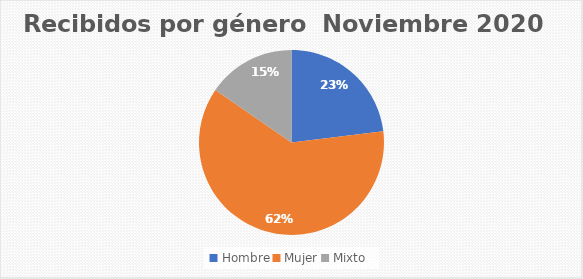
| Category | Recibidos por género  Noviembre |
|---|---|
| Hombre | 3 |
| Mujer | 8 |
| Mixto | 2 |